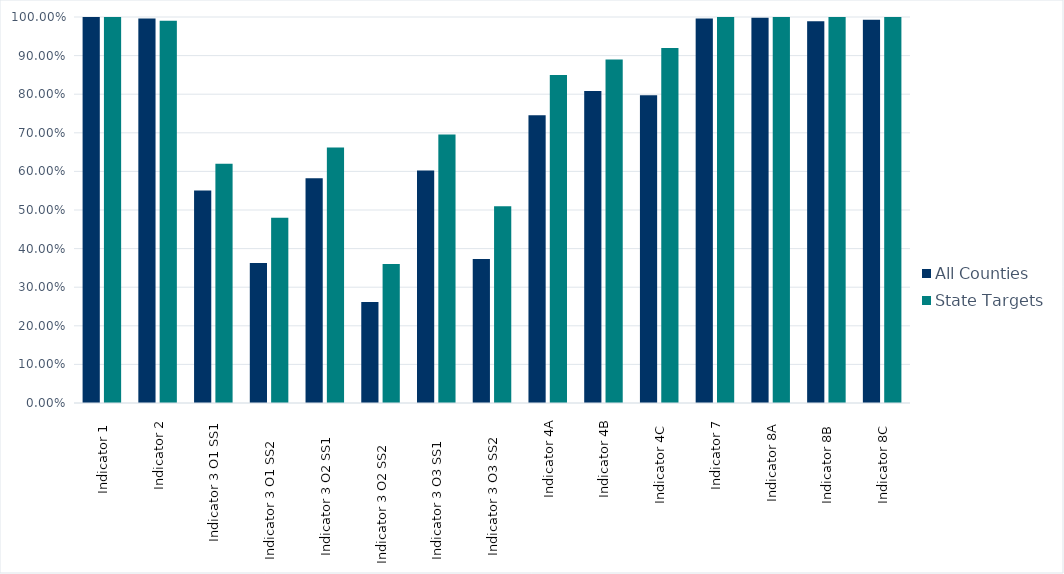
| Category | All Counties | State Targets |
|---|---|---|
| Indicator 1  | 1 | 1 |
| Indicator 2 | 0.996 | 0.99 |
| Indicator 3 O1 SS1 | 0.551 | 0.62 |
| Indicator 3 O1 SS2     | 0.363 | 0.48 |
| Indicator 3 O2 SS1    | 0.582 | 0.662 |
| Indicator 3 O2 SS2      | 0.261 | 0.36 |
| Indicator 3 O3 SS1     | 0.602 | 0.696 |
| Indicator 3 O3 SS2    | 0.373 | 0.51 |
| Indicator 4A | 0.746 | 0.85 |
| Indicator 4B | 0.808 | 0.89 |
| Indicator 4C  | 0.798 | 0.92 |
| Indicator 7 | 0.996 | 1 |
| Indicator 8A  | 0.998 | 1 |
| Indicator 8B  | 0.989 | 1 |
| Indicator 8C  | 0.993 | 1 |